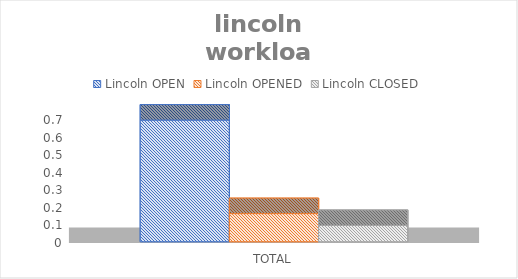
| Category | Lincoln |
|---|---|
| TOTAL | 0.093 |